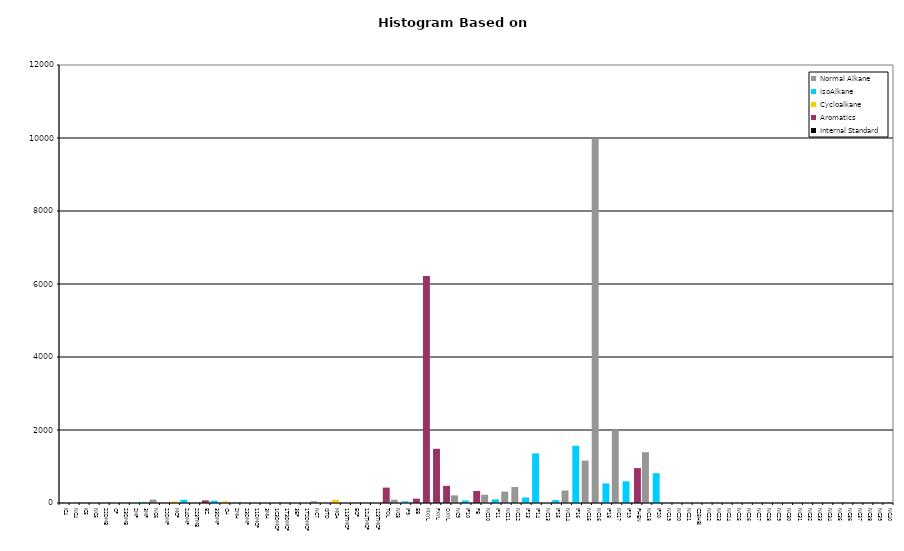
| Category | Normal Alkane | IsoAlkane | Cycloalkane | Aromatics | Internal Standard |
|---|---|---|---|---|---|
| IC4 | 0 | 0 | 0 | 0 | 0 |
| NC4 | 0 | 0 | 0 | 0 | 0 |
| IC5 | 0 | 0 | 0 | 0 | 0 |
| NC5 | 0 | 0 | 0 | 0 | 0 |
| 22DMB | 0 | 0 | 0 | 0 | 0 |
| CP | 0 | 0 | 0 | 0 | 0 |
| 23DMB | 0 | 0 | 0 | 0 | 0 |
| 2MP | 0 | 0 | 0 | 0 | 0 |
| 3MP | 0 | 24 | 0 | 0 | 0 |
| NC6 | 94 | 0 | 0 | 0 | 0 |
| 22DMP | 0 | 0 | 0 | 0 | 0 |
| MCP | 0 | 0 | 42 | 0 | 0 |
| 24DMP | 0 | 89 | 0 | 0 | 0 |
| 223TMB | 0 | 0 | 0 | 0 | 0 |
| BZ | 0 | 0 | 0 | 72 | 0 |
| 33DMP | 0 | 63 | 0 | 0 | 0 |
| CH | 0 | 0 | 45 | 0 | 0 |
| 2MH | 0 | 0 | 0 | 0 | 0 |
| 23DMP | 0 | 0 | 0 | 0 | 0 |
| 11DMCP | 0 | 0 | 0 | 0 | 0 |
| 3MH | 0 | 0 | 0 | 0 | 0 |
| 1C3DMCP | 0 | 0 | 0 | 0 | 0 |
| 1T3DMCP | 0 | 0 | 0 | 0 | 0 |
| 3EP | 0 | 0 | 0 | 0 | 0 |
| 1T2DMCP | 0 | 0 | 0 | 0 | 0 |
| NC7 | 47 | 0 | 0 | 0 | 0 |
| ISTD | 0 | 0 | 0 | 0 | 0 |
| MCH | 0 | 0 | 87 | 0 | 0 |
| 113TMCP | 0 | 0 | 0 | 0 | 0 |
| ECP | 0 | 0 | 0 | 0 | 0 |
| 124TMCP | 0 | 0 | 0 | 0 | 0 |
| 123TMCP | 0 | 0 | 0 | 0 | 0 |
| TOL | 0 | 0 | 0 | 422 | 0 |
| NC8 | 89 | 0 | 0 | 0 | 0 |
| IP9 | 0 | 46 | 0 | 0 | 0 |
| EB | 0 | 0 | 0 | 119 | 0 |
| MXYL | 0 | 0 | 0 | 6221 | 0 |
| PXYL | 0 | 0 | 0 | 1485 | 0 |
| OXYL | 0 | 0 | 0 | 469 | 0 |
| NC9 | 209 | 0 | 0 | 0 | 0 |
| IP10 | 0 | 68 | 0 | 0 | 0 |
| PB | 0 | 0 | 0 | 331 | 0 |
| NC10 | 226 | 0 | 0 | 0 | 0 |
| IP11 | 0 | 99 | 0 | 0 | 0 |
| NC11 | 312 | 0 | 0 | 0 | 0 |
| NC12 | 439 | 0 | 0 | 0 | 0 |
| IP13 | 0 | 151 | 0 | 0 | 0 |
| IP14 | 0 | 1359 | 0 | 0 | 0 |
| NC13 | 0 | 0 | 0 | 0 | 0 |
| IP15 | 0 | 79 | 0 | 0 | 0 |
| NC14 | 342 | 0 | 0 | 0 | 0 |
| IP16 | 0 | 1568 | 0 | 0 | 0 |
| NC15 | 1161 | 0 | 0 | 0 | 0 |
| NC16 | 9987 | 0 | 0 | 0 | 0 |
| IP18 | 0 | 536 | 0 | 0 | 0 |
| NC17 | 2010 | 0 | 0 | 0 | 0 |
| IP19 | 0 | 594 | 0 | 0 | 0 |
| PHEN | 0 | 0 | 0 | 957 | 0 |
| NC18 | 1392 | 0 | 0 | 0 | 0 |
| IP20 | 0 | 816 | 0 | 0 | 0 |
| NC19 | 0 | 0 | 0 | 0 | 0 |
| NC20 | 0 | 0 | 0 | 0 | 0 |
| NC21 | 0 | 0 | 0 | 0 | 0 |
| C25HBI | 0 | 0 | 0 | 0 | 0 |
| NC22 | 0 | 0 | 0 | 0 | 0 |
| NC23 | 0 | 0 | 0 | 0 | 0 |
| NC24 | 0 | 0 | 0 | 0 | 0 |
| NC25 | 0 | 0 | 0 | 0 | 0 |
| NC26 | 0 | 0 | 0 | 0 | 0 |
| NC27 | 0 | 0 | 0 | 0 | 0 |
| NC28 | 0 | 0 | 0 | 0 | 0 |
| NC29 | 0 | 0 | 0 | 0 | 0 |
| NC30 | 0 | 0 | 0 | 0 | 0 |
| NC31 | 0 | 0 | 0 | 0 | 0 |
| NC32 | 0 | 0 | 0 | 0 | 0 |
| NC33 | 0 | 0 | 0 | 0 | 0 |
| NC34 | 0 | 0 | 0 | 0 | 0 |
| NC35 | 0 | 0 | 0 | 0 | 0 |
| NC36 | 0 | 0 | 0 | 0 | 0 |
| NC37 | 0 | 0 | 0 | 0 | 0 |
| NC38 | 0 | 0 | 0 | 0 | 0 |
| NC39 | 0 | 0 | 0 | 0 | 0 |
| NC40 | 0 | 0 | 0 | 0 | 0 |